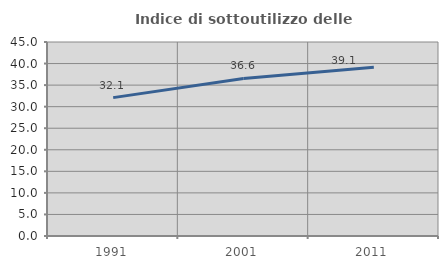
| Category | Indice di sottoutilizzo delle abitazioni  |
|---|---|
| 1991.0 | 32.097 |
| 2001.0 | 36.555 |
| 2011.0 | 39.148 |